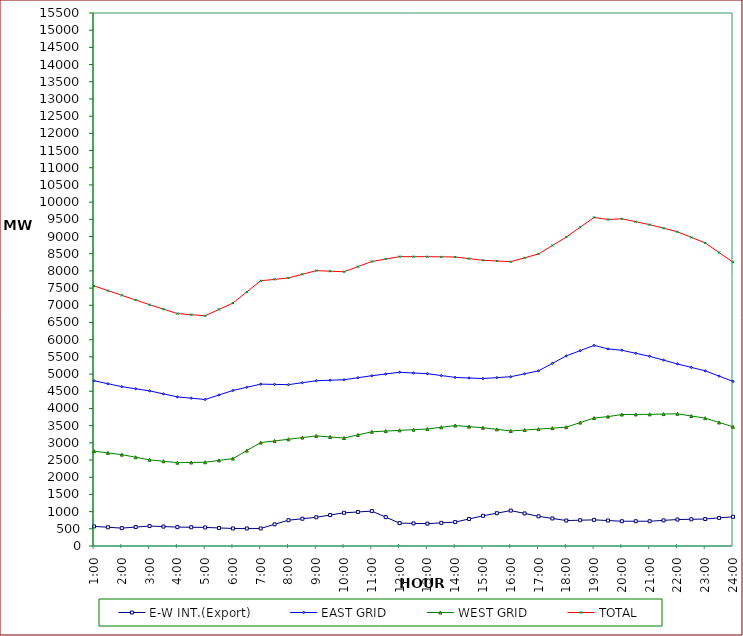
| Category | E-W INT.(Export) | EAST GRID | WEST GRID | TOTAL |
|---|---|---|---|---|
| 1:00 | 570 | 4806 | 2758 | 7564 |
| 1:30 | 545 | 4719.5 | 2707.5 | 7427 |
| 2:00 | 520 | 4633 | 2657 | 7290 |
| 2:30 | 550 | 4572 | 2581.5 | 7153.5 |
| 3:00 | 580 | 4511 | 2506 | 7017 |
| 3:30 | 565 | 4423.5 | 2464.5 | 6888 |
| 4:00 | 550 | 4336 | 2423 | 6759 |
| 4:30 | 545 | 4298 | 2429 | 6727 |
| 5:00 | 540 | 4260 | 2435 | 6695 |
| 5:30 | 525 | 4391.5 | 2488.5 | 6880 |
| 6:00 | 510 | 4523 | 2542 | 7065 |
| 6:30 | 510 | 4615 | 2774.5 | 7389.5 |
| 7:00 | 510 | 4707 | 3007 | 7714 |
| 7:30 | 630 | 4699.5 | 3055 | 7754.5 |
| 8:00 | 750 | 4692 | 3103 | 7795 |
| 8:30 | 792.5 | 4749 | 3152.5 | 7901.5 |
| 9:00 | 835 | 4806 | 3202 | 8008 |
| 9:30 | 900 | 4820.5 | 3171 | 7991.5 |
| 10:00 | 965 | 4835 | 3140 | 7975 |
| 10:30 | 990 | 4893.5 | 3230.5 | 8124 |
| 11:00 | 1015 | 4952 | 3321 | 8273 |
| 11:30 | 840 | 5002 | 3342 | 8344 |
| 12:00 | 665 | 5052 | 3363 | 8415 |
| 12:30 | 657.5 | 5031.5 | 3382.5 | 8414 |
| 13:00 | 650 | 5011 | 3402 | 8413 |
| 13:30 | 672.5 | 4956.5 | 3452.5 | 8409 |
| 14:00 | 695 | 4902 | 3503 | 8405 |
| 14:30 | 786.5 | 4886 | 3471 | 8357 |
| 15:00 | 878 | 4870 | 3439 | 8309 |
| 15:30 | 954 | 4896.5 | 3392 | 8288.5 |
| 16:00 | 1030 | 4923 | 3345 | 8268 |
| 16:30 | 946.5 | 5008.5 | 3372 | 8380.5 |
| 17:00 | 863 | 5094 | 3399 | 8493 |
| 17:30 | 801.5 | 5311.5 | 3427.5 | 8739 |
| 18:00 | 740 | 5529 | 3456 | 8985 |
| 18:30 | 750 | 5681 | 3588.5 | 9269.5 |
| 19:00 | 760 | 5833 | 3721 | 9554 |
| 19:30 | 740 | 5732 | 3763 | 9495 |
| 20:00 | 720 | 5692 | 3823 | 9515 |
| 20:30 | 720 | 5604 | 3826 | 9430 |
| 21:00 | 720 | 5516 | 3829 | 9345 |
| 21:30 | 745 | 5405 | 3836.5 | 9241.5 |
| 22:00 | 770 | 5294 | 3844 | 9138 |
| 22:30 | 777 | 5194 | 3781 | 8975 |
| 23:00 | 784 | 5094 | 3718 | 8812 |
| 23:30 | 817 | 4940.5 | 3592.5 | 8533 |
| 24:00 | 850 | 4787 | 3467 | 8254 |